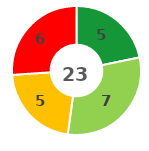
| Category | Series 0 |
|---|---|
| 0 | 5 |
| 1 | 7 |
| 2 | 5 |
| 3 | 6 |
| 4 | 0 |